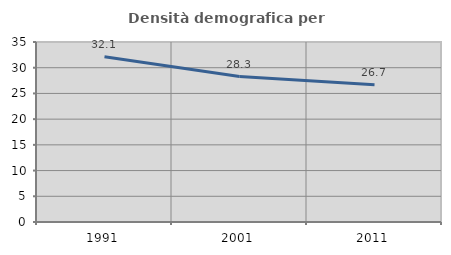
| Category | Densità demografica |
|---|---|
| 1991.0 | 32.122 |
| 2001.0 | 28.271 |
| 2011.0 | 26.699 |